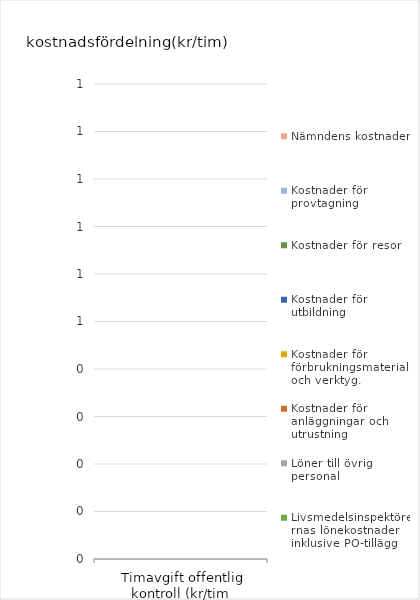
| Category | Livsmedelsinspektörernas lönekostnader inklusive PO-tillägg | Löner till övrig personal | Kostnader för anläggningar och utrustning | Kostnader för förbrukningsmaterial och verktyg.  | Kostnader för utbildning | Kostnader för resor | Kostnader för provtagning | Nämndens kostnader |
|---|---|---|---|---|---|---|---|---|
|  Timavgift offentlig kontroll (kr/tim kontrolltid)  | 0 | 0 | 0 | 0 | 0 | 0 | 0 | 0 |